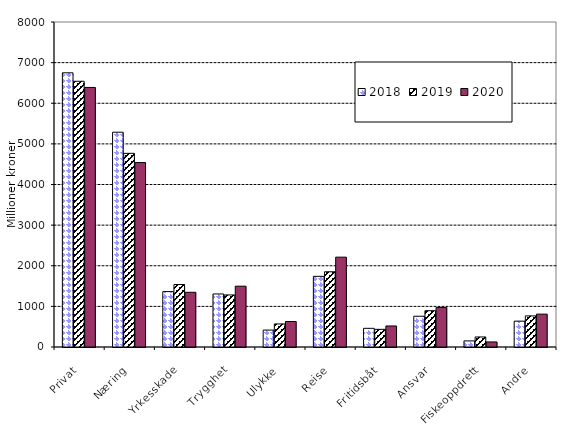
| Category | 2018 | 2019 | 2020 |
|---|---|---|---|
| Privat | 6749.281 | 6540.864 | 6389.024 |
| Næring | 5286.983 | 4767.2 | 4539.877 |
| Yrkesskade | 1363.784 | 1538.096 | 1346.565 |
| Trygghet | 1305.469 | 1281.184 | 1496.949 |
| Ulykke | 416.25 | 567.358 | 627.791 |
| Reise | 1739.103 | 1851.683 | 2211.642 |
| Fritidsbåt | 459.968 | 434.722 | 517.485 |
| Ansvar | 757.478 | 893.738 | 973.351 |
| Fiskeoppdrett | 149.75 | 247.178 | 124.359 |
| Andre | 636.403 | 765.396 | 808.908 |